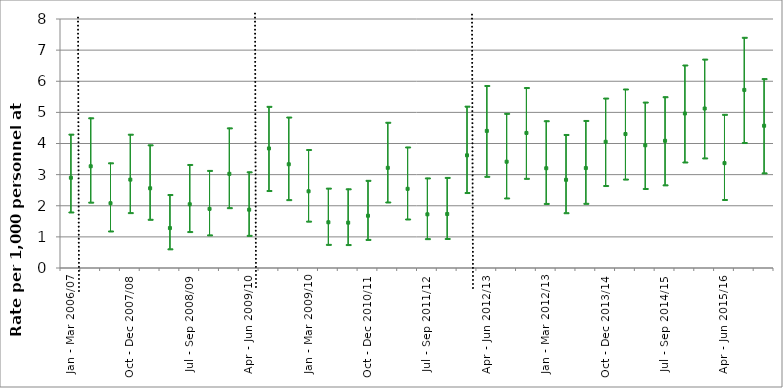
| Category | Rate of patients assessed with a mental disorder | 95% LL | 95% UL |
|---|---|---|---|
| Jan - Mar 2006/07 | 2.9 | 1.8 | 4.3 |
| Apr - Jun 2007/08 | 3.269 | 2.115 | 4.825 |
| Jul - Sep 2007/08 | 2.081 | 1.189 | 3.379 |
| Oct - Dec 2007/08 | 2.839 | 1.779 | 4.298 |
| Jan - Mar 2007/08 | 2.562 | 1.565 | 3.956 |
| Apr - Jun 2008/09 | 1.283 | 0.615 | 2.36 |
| Jul - Sep 2008/09 | 2.048 | 1.171 | 3.326 |
| Oct - Dec 2008/09 | 1.901 | 1.064 | 3.135 |
| Jan - Mar 2008/09 | 3.025 | 1.938 | 4.502 |
| Apr - Jun 2009/10 | 1.873 | 1.049 | 3.09 |
| Jul - Sep 2009/10 | 3.841 | 2.489 | 5.193 |
| Oct - Dec 2009/10 | 3.333 | 2.197 | 4.85 |
| Jan - Mar 2009/10 | 2.465 | 1.505 | 3.806 |
| Apr - Jun 2010/11 | 1.469 | 0.759 | 2.566 |
| Jul - Sep 2010/11 | 1.456 | 0.753 | 2.544 |
| Oct - Dec 2010/11 | 1.679 | 0.918 | 2.817 |
| Jan - Mar 2010/11 | 3.218 | 2.121 | 4.682 |
| Apr - Jun 2011/12 | 2.544 | 1.575 | 3.889 |
| Jul - Sep 2011/12 | 1.725 | 0.943 | 2.894 |
| Oct - Dec 2011/12 | 1.734 | 0.948 | 2.91 |
| Jan - Mar 2011/12 | 3.62 | 2.425 | 5.199 |
| Apr - Jun 2012/13 | 4.404 | 2.945 | 5.863 |
| Jul - Sep 2012/13 | 3.415 | 2.25 | 4.968 |
| Oct - Dec 2012/13 | 4.339 | 2.881 | 5.798 |
| Jan - Mar 2012/13 | 3.205 | 2.074 | 4.731 |
| Apr - Jun 2013/14 | 2.833 | 1.776 | 4.29 |
| Jul - Sep 2013/14 | 3.211 | 2.078 | 4.74 |
| Oct - Dec 2013/14 | 4.055 | 2.65 | 5.46 |
| Jan - Mar 2013/14 | 4.304 | 2.857 | 5.751 |
| Apr - Jun 2014/15 | 3.943 | 2.555 | 5.33 |
| Jul - Sep 2014/15 | 4.087 | 2.671 | 5.503 |
| Oct - Dec 2014/15 | 4.964 | 3.406 | 6.522 |
| Jan - Mar 2014/15 | 5.124 | 3.536 | 6.712 |
| Apr - Jun 2015/16 | 3.369 | 2.201 | 4.937 |
| Jul - Sep 2015/16 | 5.722 | 4.031 | 7.412 |
| Oct - Dec 2015/16 | 4.57 | 3.056 | 6.084 |